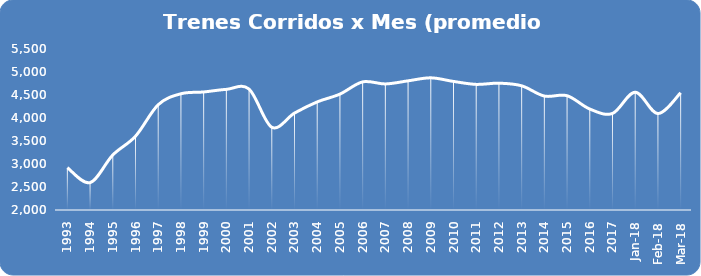
| Category | Series 0 |
|---|---|
| 1993.0 | 2920.333 |
| 1994.0 | 2595.583 |
| 1995.0 | 3195.667 |
| 1996.0 | 3603.833 |
| 1997.0 | 4288.5 |
| 1998.0 | 4527.083 |
| 1999.0 | 4565.833 |
| 2000.0 | 4622.417 |
| 2001.0 | 4628.417 |
| 2002.0 | 3798.583 |
| 2003.0 | 4107.25 |
| 2004.0 | 4349.667 |
| 2005.0 | 4519.333 |
| 2006.0 | 4785.083 |
| 2007.0 | 4740.333 |
| 2008.0 | 4808 |
| 2009.0 | 4873.333 |
| 2010.0 | 4795 |
| 2011.0 | 4730.667 |
| 2012.0 | 4757.167 |
| 2013.0 | 4700.167 |
| 2014.0 | 4477 |
| 2015.0 | 4484.25 |
| 2016.0 | 4194.917 |
| 2017.0 | 4099.417 |
| 43101.0 | 4560 |
| 43132.0 | 4097 |
| 43160.0 | 4548 |